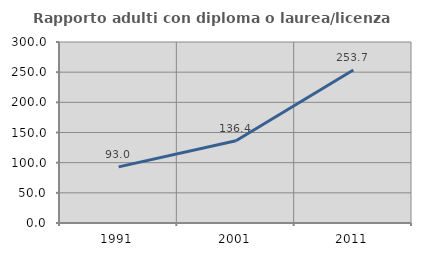
| Category | Rapporto adulti con diploma o laurea/licenza media  |
|---|---|
| 1991.0 | 92.982 |
| 2001.0 | 136.364 |
| 2011.0 | 253.704 |